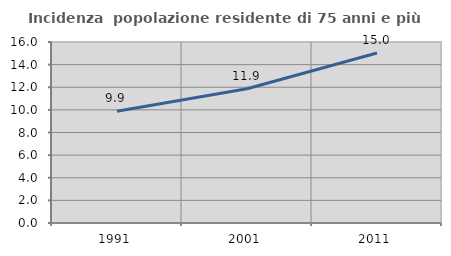
| Category | Incidenza  popolazione residente di 75 anni e più |
|---|---|
| 1991.0 | 9.87 |
| 2001.0 | 11.87 |
| 2011.0 | 15.031 |